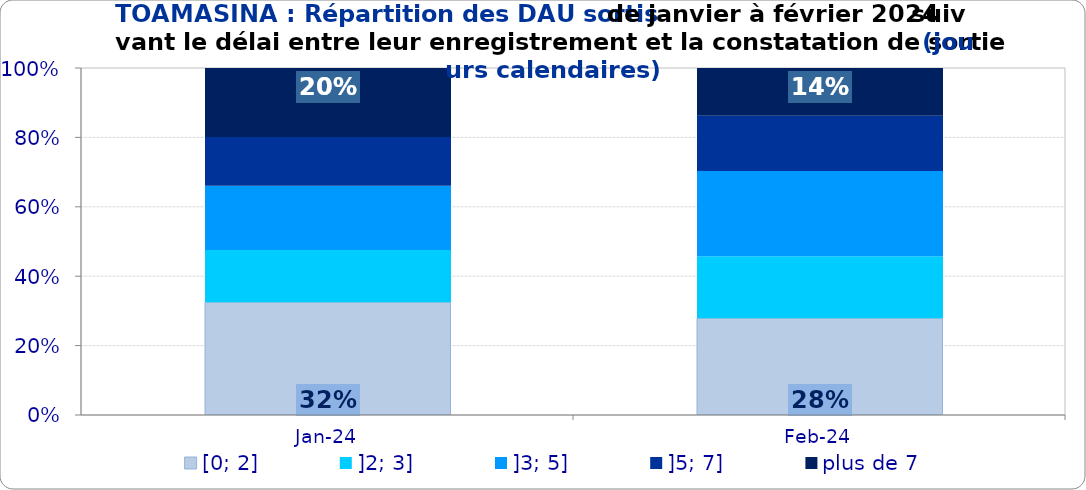
| Category | [0; 2] | ]2; 3] | ]3; 5] | ]5; 7] | plus de 7 |
|---|---|---|---|---|---|
| 2024-01-01 | 0.325 | 0.151 | 0.185 | 0.14 | 0.199 |
| 2024-02-01 | 0.279 | 0.179 | 0.245 | 0.159 | 0.138 |